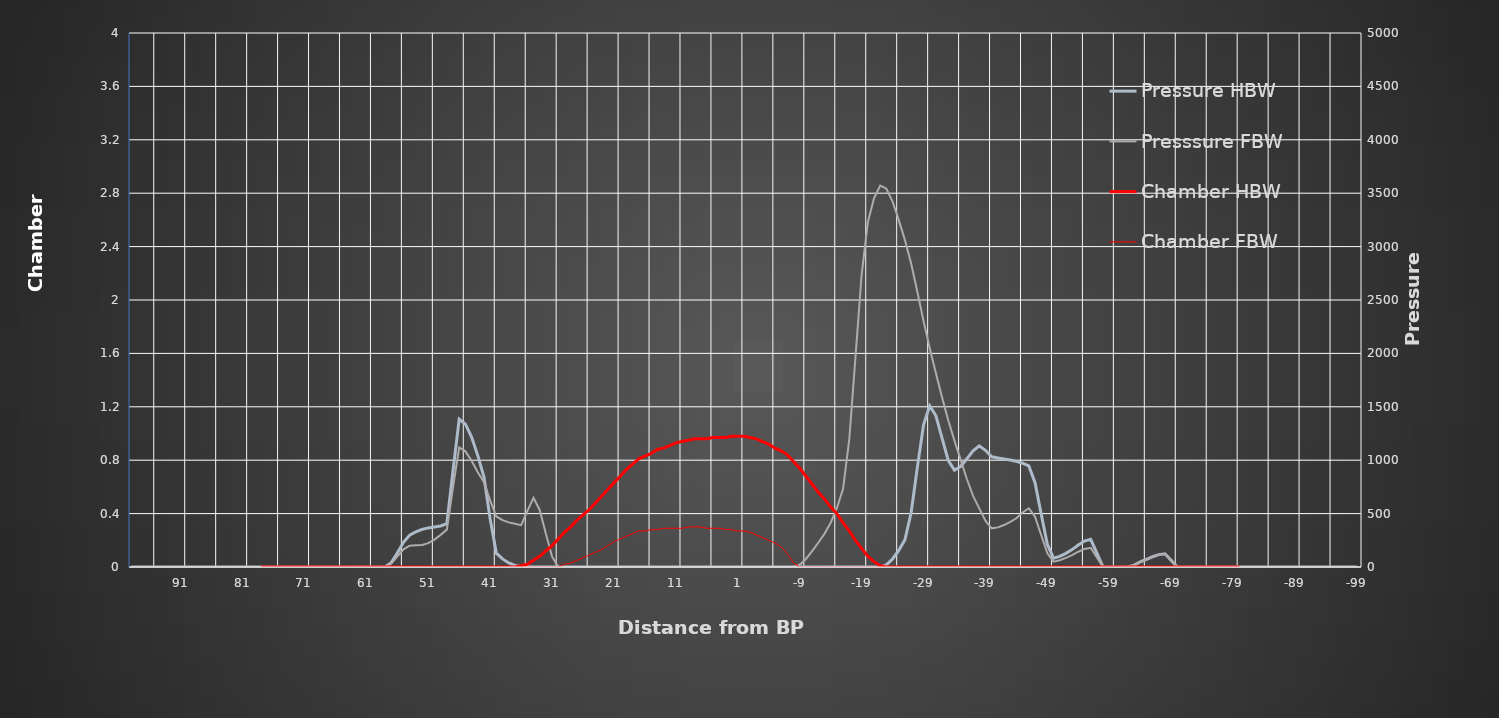
| Category | Pressure HBW | Presssure FBW |
|---|---|---|
| -99.0 | 0 | 0 |
| -98.0 | 0 | 0 |
| -97.0 | 0 | 0 |
| -96.0 | 0 | 0 |
| -95.0 | 0 | 0 |
| -94.0 | 0 | 0 |
| -93.0 | 0 | 0 |
| -92.0 | 0 | 0 |
| -91.0 | 0 | 0 |
| -90.0 | 0 | 0 |
| -89.0 | 0 | 0 |
| -88.0 | 0 | 0 |
| -87.0 | 0 | 0 |
| -86.0 | 0 | 0 |
| -85.0 | 0 | 0 |
| -84.0 | 0 | 0 |
| -83.0 | 0 | 0 |
| -82.0 | 0 | 0 |
| -81.0 | 0 | 0 |
| -80.0 | 0 | 0 |
| -79.0 | 0 | 0 |
| -78.0 | 0 | 0 |
| -77.0 | 0 | 0 |
| -76.0 | 0 | 0 |
| -75.0 | 0 | 0 |
| -74.0 | 0 | 0 |
| -73.0 | 0 | 0 |
| -72.0 | 0 | 0 |
| -71.0 | 0 | 0 |
| -70.0 | 0 | 0 |
| -69.0 | 62 | 61 |
| -68.0 | 124 | 122 |
| -67.0 | 116 | 114 |
| -66.0 | 96 | 93 |
| -65.0 | 71 | 68 |
| -64.0 | 47 | 44 |
| -63.0 | 18 | 17 |
| -62.0 | 0 | 0 |
| -61.0 | 0 | 0 |
| -60.0 | 0 | 0 |
| -59.0 | 0 | 0 |
| -58.0 | 0 | 0 |
| -57.0 | 129 | 90 |
| -56.0 | 259 | 180 |
| -55.0 | 243 | 169 |
| -54.0 | 206 | 143 |
| -53.0 | 163 | 111 |
| -52.0 | 128 | 85 |
| -51.0 | 99 | 63 |
| -50.0 | 83 | 50 |
| -49.0 | 211 | 128 |
| -48.0 | 497 | 300 |
| -47.0 | 791 | 472 |
| -46.0 | 946 | 550 |
| -45.0 | 972 | 511 |
| -44.0 | 989 | 456 |
| -43.0 | 1001 | 423 |
| -42.0 | 1011 | 393 |
| -41.0 | 1021 | 371 |
| -40.0 | 1032 | 362 |
| -39.0 | 1093 | 433 |
| -38.0 | 1135 | 549 |
| -37.0 | 1087 | 666 |
| -36.0 | 1013 | 824 |
| -35.0 | 943 | 1003 |
| -34.0 | 906 | 1182 |
| -33.0 | 996 | 1371 |
| -32.0 | 1205 | 1586 |
| -31.0 | 1416 | 1815 |
| -30.0 | 1510 | 2048 |
| -29.0 | 1331 | 2302 |
| -28.0 | 933 | 2577 |
| -27.0 | 510 | 2841 |
| -26.0 | 255 | 3059 |
| -25.0 | 156 | 3248 |
| -24.0 | 75 | 3422 |
| -23.0 | 20 | 3542 |
| -22.0 | 0 | 3571 |
| -21.0 | 0 | 3453 |
| -20.0 | 0 | 3227 |
| -19.0 | 0 | 2738 |
| -18.0 | 0 | 1961 |
| -17.0 | 0 | 1193 |
| -16.0 | 0 | 732 |
| -15.0 | 0 | 550 |
| -14.0 | 0 | 414 |
| -13.0 | 0 | 311 |
| -12.0 | 0 | 227 |
| -11.0 | 0 | 148 |
| -10.0 | 0 | 75 |
| -9.0 | 0 | 21 |
| -8.0 | 0 | 0 |
| -7.0 | 0 | 0 |
| -6.0 | 0 | 0 |
| -5.0 | 0 | 0 |
| -4.0 | 0 | 0 |
| -3.0 | 0 | 0 |
| -2.0 | 0 | 0 |
| -1.0 | 0 | 0 |
| 0.0 | 0 | 0 |
| 1.0 | 0 | 0 |
| 2.0 | 0 | 0 |
| 3.0 | 0 | 0 |
| 4.0 | 0 | 0 |
| 5.0 | 0 | 0 |
| 6.0 | 0 | 0 |
| 7.0 | 0 | 0 |
| 8.0 | 0 | 0 |
| 9.0 | 0 | 0 |
| 10.0 | 0 | 0 |
| 11.0 | 0 | 0 |
| 12.0 | 0 | 0 |
| 13.0 | 0 | 0 |
| 14.0 | 0 | 0 |
| 15.0 | 0 | 0 |
| 16.0 | 0 | 0 |
| 17.0 | 0 | 0 |
| 18.0 | 0 | 0 |
| 19.0 | 0 | 0 |
| 20.0 | 0 | 0 |
| 21.0 | 0 | 0 |
| 22.0 | 0 | 0 |
| 23.0 | 0 | 0 |
| 24.0 | 0 | 0 |
| 25.0 | 0 | 0 |
| 26.0 | 0 | 0 |
| 27.0 | 0 | 0 |
| 28.0 | 0 | 0 |
| 29.0 | 0 | 0 |
| 30.0 | 0 | 0 |
| 31.0 | 0 | 97 |
| 32.0 | 0 | 312 |
| 33.0 | 0 | 534 |
| 34.0 | 0 | 649 |
| 35.0 | 2 | 523 |
| 36.0 | 5 | 392 |
| 37.0 | 14 | 405 |
| 38.0 | 38 | 418 |
| 39.0 | 76 | 439 |
| 40.0 | 129 | 473 |
| 41.0 | 450 | 624 |
| 42.0 | 843 | 793 |
| 43.0 | 1043 | 887 |
| 44.0 | 1216 | 995 |
| 45.0 | 1338 | 1083 |
| 46.0 | 1384 | 1120 |
| 47.0 | 902 | 747 |
| 48.0 | 406 | 350 |
| 49.0 | 384 | 301 |
| 50.0 | 374 | 257 |
| 51.0 | 366 | 223 |
| 52.0 | 352 | 207 |
| 53.0 | 330 | 203 |
| 54.0 | 299 | 199 |
| 55.0 | 231 | 165 |
| 56.0 | 131 | 97 |
| 57.0 | 40 | 30 |
| 58.0 | 0 | 0 |
| 59.0 | 0 | 0 |
| 60.0 | 0 | 0 |
| 61.0 | 0 | 0 |
| 62.0 | 0 | 0 |
| 63.0 | 0 | 0 |
| 64.0 | 0 | 0 |
| 65.0 | 0 | 0 |
| 66.0 | 0 | 0 |
| 67.0 | 0 | 0 |
| 68.0 | 0 | 0 |
| 69.0 | 0 | 0 |
| 70.0 | 0 | 0 |
| 71.0 | 0 | 0 |
| 72.0 | 0 | 0 |
| 73.0 | 0 | 0 |
| 74.0 | 0 | 0 |
| 75.0 | 0 | 0 |
| 76.0 | 0 | 0 |
| 77.0 | 0 | 0 |
| 78.0 | 0 | 0 |
| 79.0 | 0 | 0 |
| 80.0 | 0 | 0 |
| 81.0 | 0 | 0 |
| 82.0 | 0 | 0 |
| 83.0 | 0 | 0 |
| 84.0 | 0 | 0 |
| 85.0 | 0 | 0 |
| 86.0 | 0 | 0 |
| 87.0 | 0 | 0 |
| 88.0 | 0 | 0 |
| 89.0 | 0 | 0 |
| 90.0 | 0 | 0 |
| 91.0 | 0 | 0 |
| 92.0 | 0 | 0 |
| 93.0 | 0 | 0 |
| 94.0 | 0 | 0 |
| 95.0 | 0 | 0 |
| 96.0 | 0 | 0 |
| 97.0 | 0 | 0 |
| 98.0 | 0 | 0 |
| 99.0 | 0 | 0 |